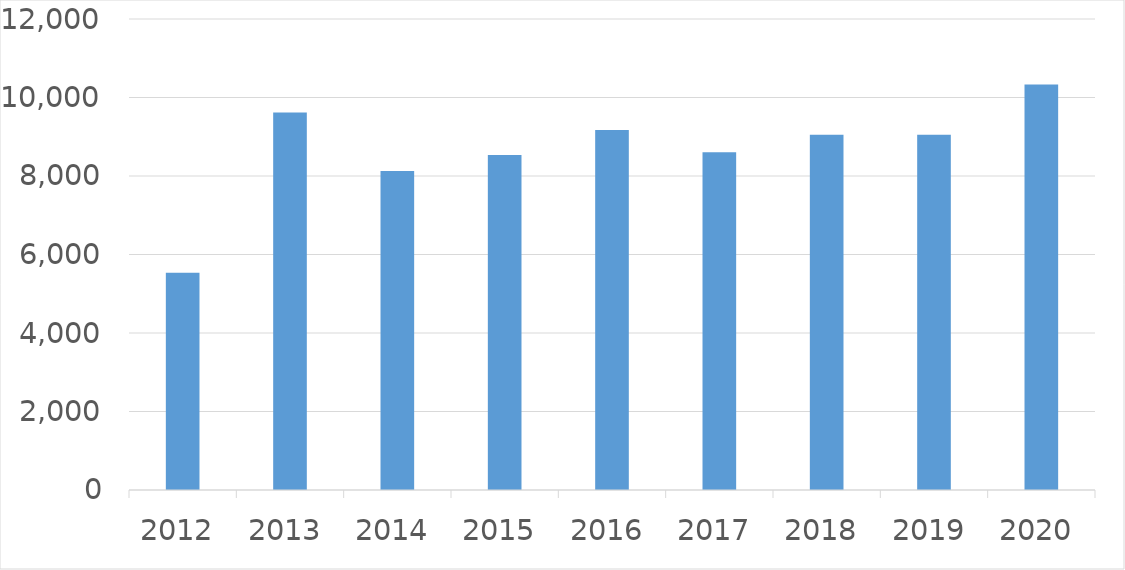
| Category | Series 0 |
|---|---|
| 2012 | 5536 |
| 2013 | 9615 |
| 2014 | 8126 |
| 2015 | 8535 |
| 2016 | 9171 |
| 2017 | 8603 |
| 2018 | 9048 |
| 2019 | 9054 |
| 2020 | 10332 |